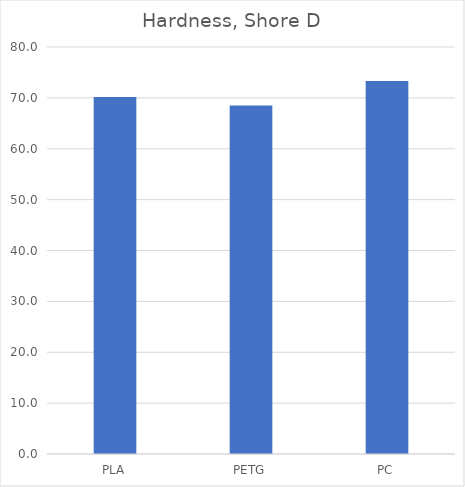
| Category | Shore D |
|---|---|
| PLA | 70.167 |
| PETG | 68.5 |
| PC | 73.333 |